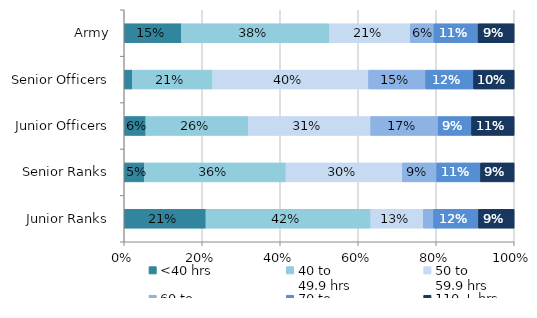
| Category | <40 hrs | 40 to 
49.9 hrs | 50 to 
59.9 hrs | 60 to 
69.9 hrs | 70 to 
109.9 hrs | 110 + hrs |
|---|---|---|---|---|---|---|
| Army | 0.147 | 0.38 | 0.207 | 0.061 | 0.113 | 0.093 |
| Senior Officers | 0.021 | 0.206 | 0.4 | 0.146 | 0.123 | 0.104 |
| Junior Officers | 0.055 | 0.263 | 0.314 | 0.173 | 0.086 | 0.109 |
| Senior Ranks | 0.051 | 0.363 | 0.299 | 0.088 | 0.112 | 0.086 |
| Junior Ranks | 0.21 | 0.422 | 0.135 | 0.026 | 0.115 | 0.092 |